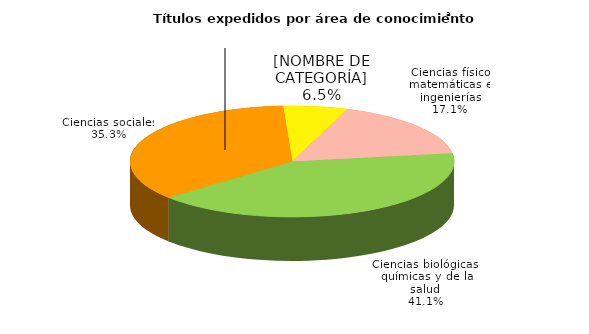
| Category | Series 0 |
|---|---|
| Ciencias físico matemáticas e ingenierías | 3110 |
| Ciencias biológicas, químicas y de la salud | 7465 |
| Ciencias sociales | 6421 |
| Humanidades y artes | 1175 |